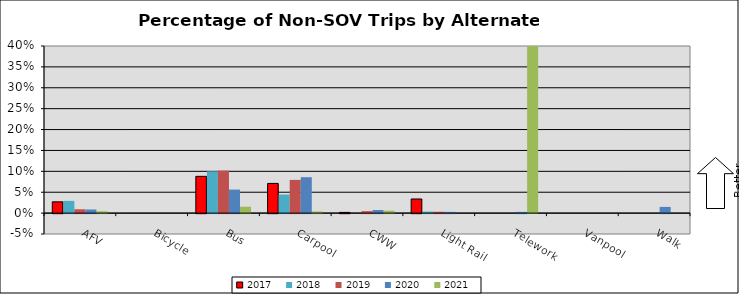
| Category | 2017 | 2018 | 2019 | 2020 | 2021 |
|---|---|---|---|---|---|
| AFV | 0.027 | 0.029 | 0.009 | 0.009 | 0.004 |
| Bicycle | 0 | 0 | 0 | 0 | 0 |
| Bus | 0.088 | 0.1 | 0.102 | 0.056 | 0.015 |
| Carpool | 0.071 | 0.044 | 0.079 | 0.086 | 0.004 |
| CWW | 0.002 | 0 | 0.005 | 0.007 | 0.006 |
| Light Rail | 0.034 | 0.004 | 0.003 | 0.003 | 0 |
| Telework | 0 | 0 | 0 | 0.003 | 0.576 |
| Vanpool | 0 | 0 | 0 | 0 | 0 |
| Walk | 0 | 0 | 0 | 0.015 | 0 |